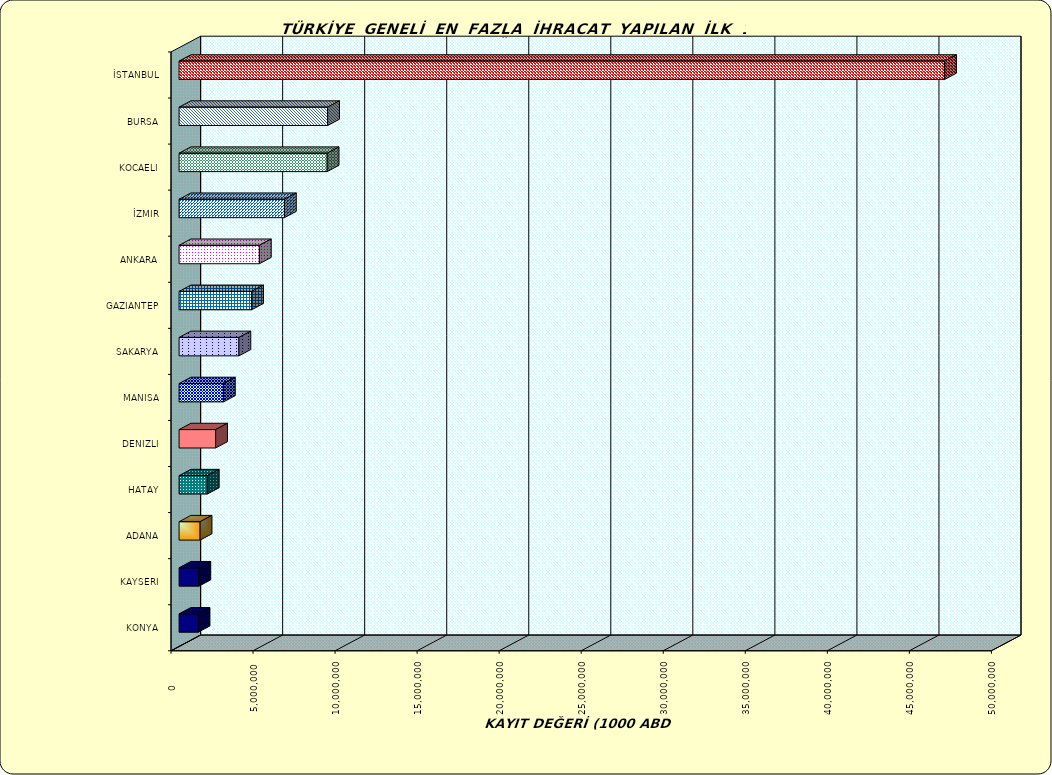
| Category | Series 0 |
|---|---|
| İSTANBUL | 46654624.844 |
| BURSA | 9053178.821 |
| KOCAELI | 9025613.574 |
| İZMIR | 6420904.912 |
| ANKARA | 4894209.264 |
| GAZIANTEP | 4419959.034 |
| SAKARYA | 3647487.074 |
| MANISA | 2702068.915 |
| DENIZLI | 2228088.518 |
| HATAY | 1720559.572 |
| ADANA | 1282303.941 |
| KAYSERI | 1205670.577 |
| KONYA | 1158940.672 |